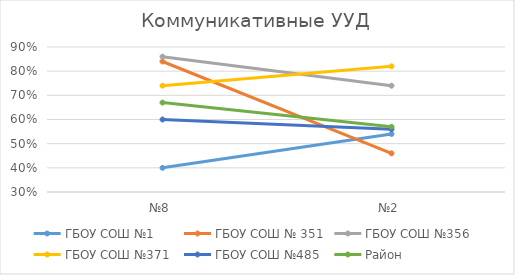
| Category | ГБОУ СОШ №1 | ГБОУ СОШ № 351 | ГБОУ СОШ №356 | ГБОУ СОШ №371 | ГБОУ СОШ №485 | Район |
|---|---|---|---|---|---|---|
| №8 | 0.4 | 0.84 | 0.86 | 0.74 | 0.6 | 0.67 |
| №2 | 0.54 | 0.46 | 0.74 | 0.82 | 0.56 | 0.57 |